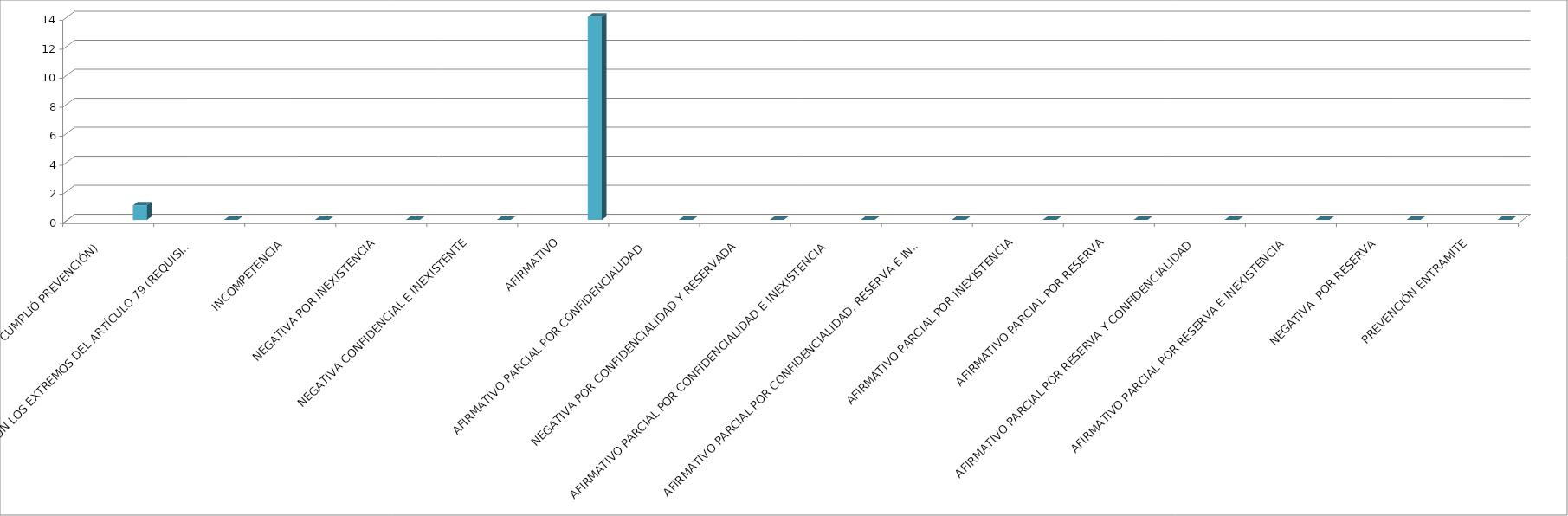
| Category | Series 0 | Series 1 | Series 2 | Series 3 | Series 4 |
|---|---|---|---|---|---|
| SE TIENE POR NO PRESENTADA ( NO CUMPLIÓ PREVENCIÓN) |  |  |  |  | 1 |
| NO CUMPLIO CON LOS EXTREMOS DEL ARTÍCULO 79 (REQUISITOS) |  |  |  |  | 0 |
| INCOMPETENCIA  |  |  |  |  | 0 |
| NEGATIVA POR INEXISTENCIA |  |  |  |  | 0 |
| NEGATIVA CONFIDENCIAL E INEXISTENTE |  |  |  |  | 0 |
| AFIRMATIVO |  |  |  |  | 14 |
| AFIRMATIVO PARCIAL POR CONFIDENCIALIDAD  |  |  |  |  | 0 |
| NEGATIVA POR CONFIDENCIALIDAD Y RESERVADA |  |  |  |  | 0 |
| AFIRMATIVO PARCIAL POR CONFIDENCIALIDAD E INEXISTENCIA |  |  |  |  | 0 |
| AFIRMATIVO PARCIAL POR CONFIDENCIALIDAD, RESERVA E INEXISTENCIA |  |  |  |  | 0 |
| AFIRMATIVO PARCIAL POR INEXISTENCIA |  |  |  |  | 0 |
| AFIRMATIVO PARCIAL POR RESERVA |  |  |  |  | 0 |
| AFIRMATIVO PARCIAL POR RESERVA Y CONFIDENCIALIDAD |  |  |  |  | 0 |
| AFIRMATIVO PARCIAL POR RESERVA E INEXISTENCIA |  |  |  |  | 0 |
| NEGATIVA  POR RESERVA |  |  |  |  | 0 |
| PREVENCIÓN ENTRAMITE |  |  |  |  | 0 |